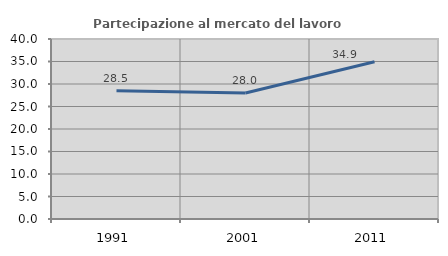
| Category | Partecipazione al mercato del lavoro  femminile |
|---|---|
| 1991.0 | 28.523 |
| 2001.0 | 28.014 |
| 2011.0 | 34.933 |